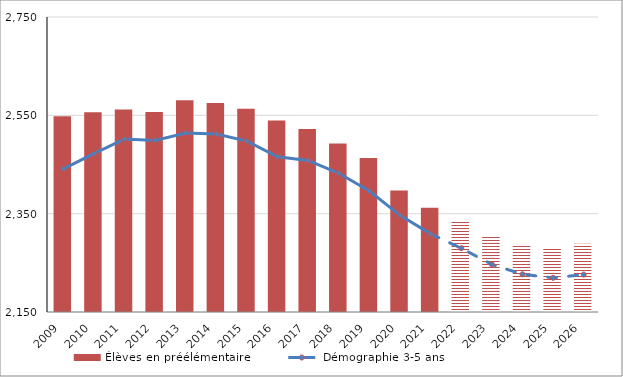
| Category | Élèves en préélémentaire |
|---|---|
| 2009.0 | 2547.9 |
| 2010.0 | 2556.1 |
| 2011.0 | 2561.8 |
| 2012.0 | 2557 |
| 2013.0 | 2580.9 |
| 2014.0 | 2574.9 |
| 2015.0 | 2563.6 |
| 2016.0 | 2539.5 |
| 2017.0 | 2522.3 |
| 2018.0 | 2492.5 |
| 2019.0 | 2463.4 |
| 2020.0 | 2396.9 |
| 2021.0 | 2361.9 |
| 2022.0 | 2333.9 |
| 2023.0 | 2304.3 |
| 2024.0 | 2287.4 |
| 2025.0 | 2281.6 |
| 2026.0 | 2288.7 |